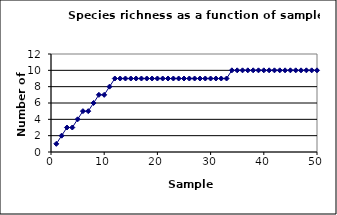
| Category | Series 0 |
|---|---|
| 1.0 | 1 |
| 2.0 | 2 |
| 3.0 | 3 |
| 4.0 | 3 |
| 5.0 | 4 |
| 6.0 | 5 |
| 7.0 | 5 |
| 8.0 | 6 |
| 9.0 | 7 |
| 10.0 | 7 |
| 11.0 | 8 |
| 12.0 | 9 |
| 13.0 | 9 |
| 14.0 | 9 |
| 15.0 | 9 |
| 16.0 | 9 |
| 17.0 | 9 |
| 18.0 | 9 |
| 19.0 | 9 |
| 20.0 | 9 |
| 21.0 | 9 |
| 22.0 | 9 |
| 23.0 | 9 |
| 24.0 | 9 |
| 25.0 | 9 |
| 26.0 | 9 |
| 27.0 | 9 |
| 28.0 | 9 |
| 29.0 | 9 |
| 30.0 | 9 |
| 31.0 | 9 |
| 32.0 | 9 |
| 33.0 | 9 |
| 34.0 | 10 |
| 35.0 | 10 |
| 36.0 | 10 |
| 37.0 | 10 |
| 38.0 | 10 |
| 39.0 | 10 |
| 40.0 | 10 |
| 41.0 | 10 |
| 42.0 | 10 |
| 43.0 | 10 |
| 44.0 | 10 |
| 45.0 | 10 |
| 46.0 | 10 |
| 47.0 | 10 |
| 48.0 | 10 |
| 49.0 | 10 |
| 50.0 | 10 |